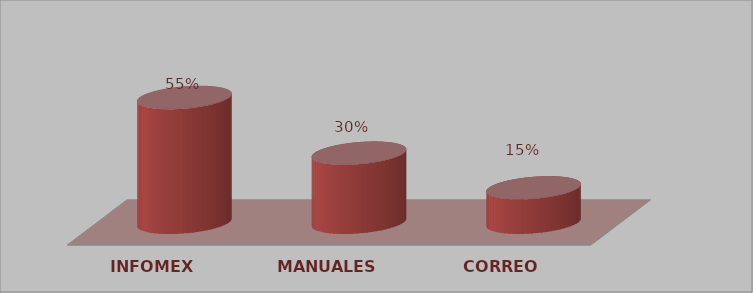
| Category | Series 0 | Series 1 |
|---|---|---|
| INFOMEX | 173 | 0.546 |
| MANUALES | 96 | 0.303 |
| CORREO | 48 | 0.151 |